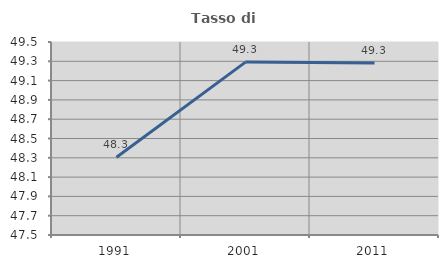
| Category | Tasso di occupazione   |
|---|---|
| 1991.0 | 48.306 |
| 2001.0 | 49.292 |
| 2011.0 | 49.283 |